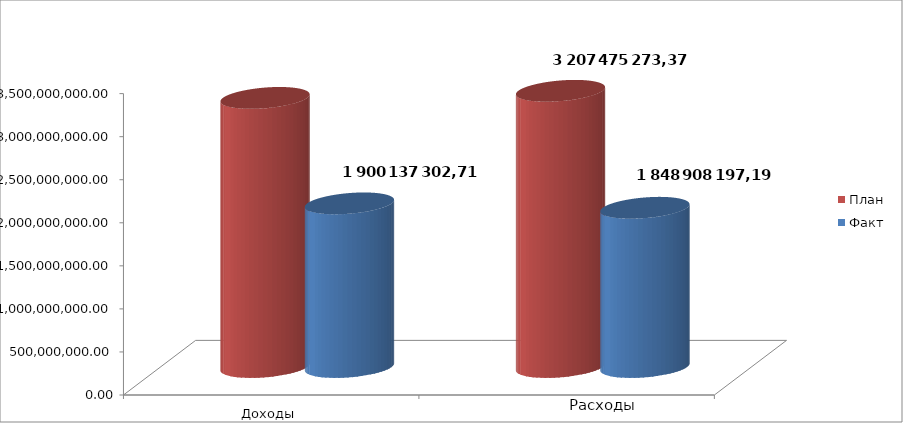
| Category | План | Факт |
|---|---|---|
| 0 | 3125142254.49 | 1900137302.71 |
| 1 | 3207475273.37 | 1848908197.19 |